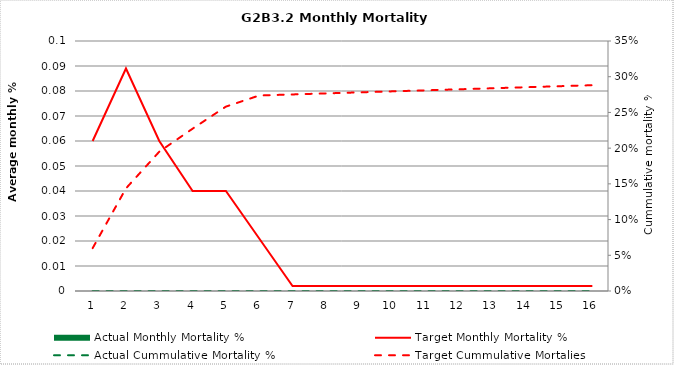
| Category | Actual Monthly Mortality % |
|---|---|
| 0 | 0 |
| 1 | 0 |
| 2 | 0 |
| 3 | 0 |
| 4 | 0 |
| 5 | 0 |
| 6 | 0 |
| 7 | 0 |
| 8 | 0 |
| 9 | 0 |
| 10 | 0 |
| 11 | 0 |
| 12 | 0 |
| 13 | 0 |
| 14 | 0 |
| 15 | 0 |